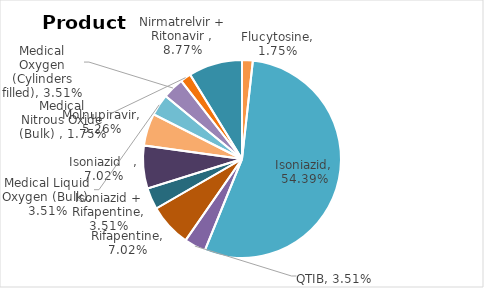
| Category | Total |
|---|---|
| Flucytosine | 0.018 |
| Isoniazid | 0.544 |
| QTIB | 0.035 |
| Rifapentine | 0.07 |
| Isoniazid + Rifapentine | 0.035 |
| Isoniazid    | 0.07 |
| Molnupiravir | 0.053 |
| Medical Liquid Oxygen (Bulk) | 0.035 |
| Medical Oxygen (Cylinders filled) | 0.035 |
| Medical Nitrous Oxide (Bulk)  | 0.018 |
| Nirmatrelvir + Ritonavir  | 0.088 |